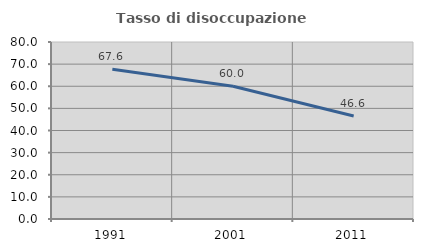
| Category | Tasso di disoccupazione giovanile  |
|---|---|
| 1991.0 | 67.635 |
| 2001.0 | 60 |
| 2011.0 | 46.565 |